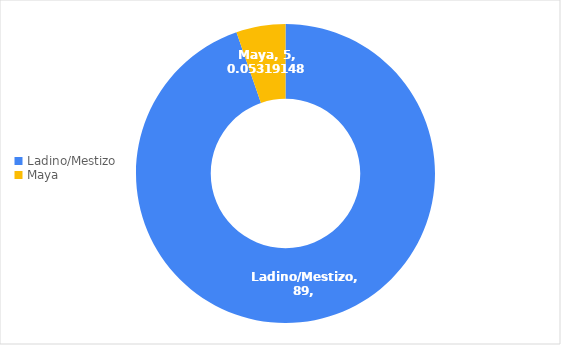
| Category | Series 0 |
|---|---|
| Ladino/Mestizo | 89 |
| Maya | 5 |